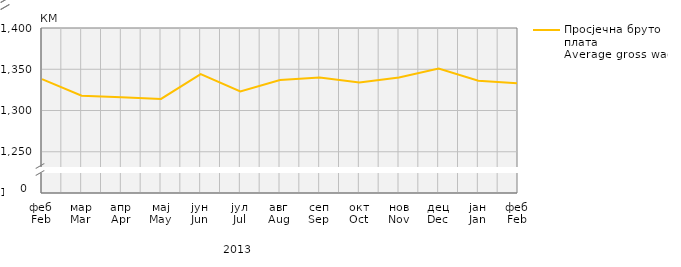
| Category | Просјечна бруто плата
Average gross wage |
|---|---|
| феб
Feb | 1338 |
| мар
Mar | 1318 |
| апр
Apr | 1316 |
| мај
May | 1314 |
| јун
Jun | 1344 |
| јул
Jul | 1323 |
| авг
Aug | 1337 |
| сеп
Sep | 1340 |
| окт
Oct | 1334 |
| нов
Nov | 1340 |
| дец
Dec | 1351 |
| јан
Jan | 1336 |
| феб
Feb | 1333 |